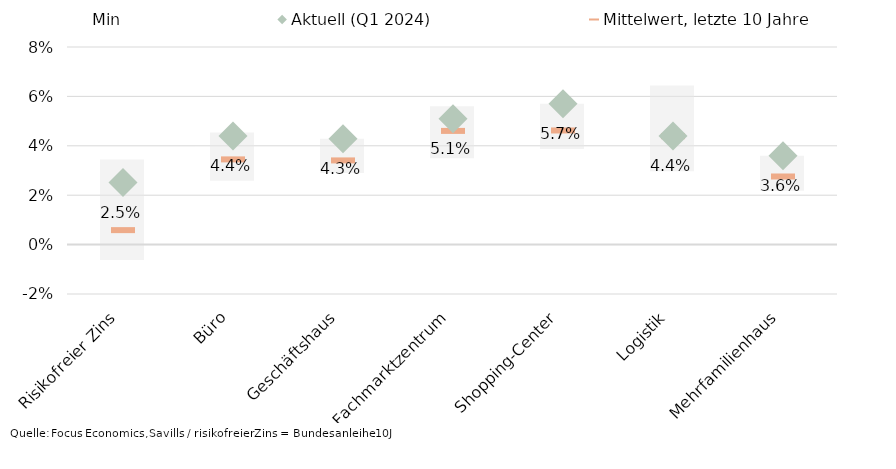
| Category | Min | Spanne Min/Max, letzte 10 Jahre |
|---|---|---|
| Risikofreier Zins | -0.006 | 0.034 |
| Büro | 0.026 | 0.02 |
| Geschäftshaus | 0.029 | 0.014 |
| Fachmarktzentrum | 0.035 | 0.021 |
| Shopping-Center | 0.039 | 0.018 |
| Logistik | 0.03 | 0.035 |
| Mehrfamilienhaus | 0.022 | 0.014 |